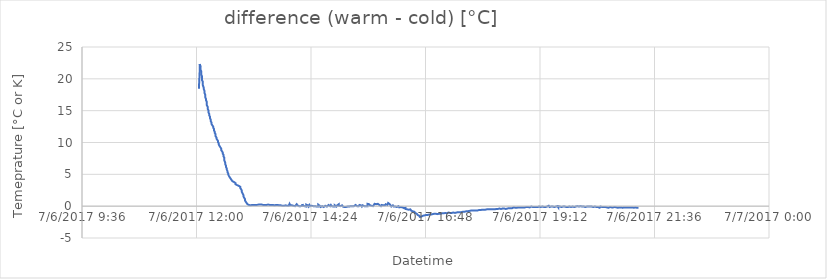
| Category | difference (warm - cold) [°C] |
|---|---|
| 42922.50208333333 | 18.44 |
| 42922.50277777778 | 21.19 |
| 42922.50277777778 | 22.13 |
| 42922.50277777778 | 22.31 |
| 42922.50277777778 | 22.31 |
| 42922.50347222222 | 22.19 |
| 42922.50347222222 | 21.94 |
| 42922.50347222222 | 21.69 |
| 42922.50347222222 | 21.44 |
| 42922.504166666666 | 21.19 |
| 42922.504166666666 | 21 |
| 42922.504166666666 | 20.81 |
| 42922.504166666666 | 20.62 |
| 42922.50486111111 | 20.37 |
| 42922.50486111111 | 20.12 |
| 42922.50486111111 | 19.94 |
| 42922.50486111111 | 19.75 |
| 42922.50555555556 | 19.56 |
| 42922.50555555556 | 19.37 |
| 42922.50555555556 | 19.19 |
| 42922.50555555556 | 19 |
| 42922.50625 | 18.87 |
| 42922.50625 | 18.62 |
| 42922.50625 | 18.44 |
| 42922.50625 | 18.31 |
| 42922.506944444445 | 18.12 |
| 42922.506944444445 | 18 |
| 42922.506944444445 | 17.81 |
| 42922.50763888889 | 17.69 |
| 42922.50763888889 | 17.5 |
| 42922.50763888889 | 17.31 |
| 42922.50763888889 | 17.12 |
| 42922.50833333333 | 17 |
| 42922.50833333333 | 16.81 |
| 42922.50833333333 | 16.62 |
| 42922.50833333333 | 16.5 |
| 42922.50902777778 | 16.37 |
| 42922.50902777778 | 16.19 |
| 42922.50902777778 | 16.06 |
| 42922.50902777778 | 15.88 |
| 42922.509722222225 | 15.75 |
| 42922.509722222225 | 15.63 |
| 42922.509722222225 | 15.5 |
| 42922.509722222225 | 15.31 |
| 42922.510416666664 | 15.19 |
| 42922.510416666664 | 15.06 |
| 42922.510416666664 | 14.94 |
| 42922.510416666664 | 14.75 |
| 42922.51111111111 | 14.69 |
| 42922.51111111111 | 14.5 |
| 42922.51111111111 | 14.38 |
| 42922.51111111111 | 14.25 |
| 42922.51180555556 | 14.13 |
| 42922.51180555556 | 14.06 |
| 42922.51180555556 | 13.94 |
| 42922.51180555556 | 13.81 |
| 42922.5125 | 13.69 |
| 42922.5125 | 13.56 |
| 42922.5125 | 13.44 |
| 42922.5125 | 13.31 |
| 42922.513194444444 | 13.25 |
| 42922.513194444444 | 13.13 |
| 42922.513194444444 | 13 |
| 42922.513194444444 | 12.88 |
| 42922.51388888889 | 12.75 |
| 42922.51388888889 | 12.69 |
| 42922.51388888889 | 12.56 |
| 42922.51458333333 | 12.5 |
| 42922.51458333333 | 12.31 |
| 42922.51458333333 | 12.31 |
| 42922.51458333333 | 12.19 |
| 42922.51527777778 | 12.13 |
| 42922.51527777778 | 12 |
| 42922.51527777778 | 11.88 |
| 42922.51527777778 | 11.75 |
| 42922.51597222222 | 11.69 |
| 42922.51597222222 | 11.56 |
| 42922.51597222222 | 11.5 |
| 42922.51597222222 | 11.38 |
| 42922.51666666667 | 11.31 |
| 42922.51666666667 | 11.25 |
| 42922.51666666667 | 11.19 |
| 42922.51666666667 | 11 |
| 42922.51736111111 | 10.88 |
| 42922.51736111111 | 10.81 |
| 42922.51736111111 | 10.75 |
| 42922.51736111111 | 10.63 |
| 42922.518055555556 | 10.63 |
| 42922.518055555556 | 10.5 |
| 42922.518055555556 | 10.44 |
| 42922.518055555556 | 10.31 |
| 42922.51875 | 10.25 |
| 42922.51875 | 10.19 |
| 42922.51875 | 10.06 |
| 42922.51875 | 10 |
| 42922.51944444444 | 9.88 |
| 42922.51944444444 | 9.81 |
| 42922.51944444444 | 9.75 |
| 42922.51944444444 | 9.69 |
| 42922.52013888889 | 9.63 |
| 42922.52013888889 | 9.56 |
| 42922.52013888889 | 9.44 |
| 42922.52013888889 | 9.38 |
| 42922.520833333336 | 9.31 |
| 42922.520833333336 | 9.25 |
| 42922.520833333336 | 9.19 |
| 42922.521527777775 | 9.06 |
| 42922.521527777775 | 9 |
| 42922.521527777775 | 8.94 |
| 42922.521527777775 | 8.81 |
| 42922.52222222222 | 8.75 |
| 42922.52222222222 | 8.69 |
| 42922.52222222222 | 8.63 |
| 42922.52222222222 | 8.5 |
| 42922.52291666667 | 8.44 |
| 42922.52291666667 | 8.31 |
| 42922.52291666667 | 8.25 |
| 42922.52291666667 | 8.13 |
| 42922.52361111111 | 8.06 |
| 42922.52361111111 | 7.94 |
| 42922.52361111111 | 7.81 |
| 42922.52361111111 | 7.69 |
| 42922.524305555555 | 7.62 |
| 42922.524305555555 | 7.44 |
| 42922.524305555555 | 7.31 |
| 42922.524305555555 | 7.19 |
| 42922.525 | 7.06 |
| 42922.525 | 6.87 |
| 42922.525 | 6.81 |
| 42922.525 | 6.62 |
| 42922.52569444444 | 6.56 |
| 42922.52569444444 | 6.37 |
| 42922.52569444444 | 6.25 |
| 42922.52569444444 | 6.19 |
| 42922.52638888889 | 6.06 |
| 42922.52638888889 | 5.94 |
| 42922.52638888889 | 5.75 |
| 42922.52638888889 | 5.69 |
| 42922.527083333334 | 5.5 |
| 42922.527083333334 | 5.44 |
| 42922.527083333334 | 5.31 |
| 42922.52777777778 | 5.19 |
| 42922.52777777778 | 5.12 |
| 42922.52777777778 | 5.06 |
| 42922.52777777778 | 4.94 |
| 42922.52847222222 | 4.87 |
| 42922.52847222222 | 4.81 |
| 42922.52847222222 | 4.69 |
| 42922.52847222222 | 4.62 |
| 42922.52916666667 | 4.56 |
| 42922.52916666667 | 4.5 |
| 42922.52916666667 | 4.44 |
| 42922.52916666667 | 4.37 |
| 42922.529861111114 | 4.31 |
| 42922.529861111114 | 4.25 |
| 42922.529861111114 | 4.19 |
| 42922.53055555555 | 4.19 |
| 42922.53055555555 | 4.12 |
| 42922.53055555555 | 4.12 |
| 42922.53055555555 | 4.06 |
| 42922.53125 | 4.06 |
| 42922.53125 | 4 |
| 42922.53125 | 3.94 |
| 42922.53125 | 3.87 |
| 42922.53194444445 | 3.94 |
| 42922.53194444445 | 3.87 |
| 42922.53194444445 | 3.81 |
| 42922.53194444445 | 3.81 |
| 42922.532638888886 | 3.81 |
| 42922.532638888886 | 3.75 |
| 42922.532638888886 | 3.81 |
| 42922.532638888886 | 3.81 |
| 42922.53333333333 | 3.75 |
| 42922.53333333333 | 3.75 |
| 42922.53333333333 | 3.69 |
| 42922.53333333333 | 3.69 |
| 42922.53402777778 | 3.62 |
| 42922.53402777778 | 3.56 |
| 42922.53402777778 | 3.5 |
| 42922.53402777778 | 3.44 |
| 42922.53472222222 | 3.44 |
| 42922.53472222222 | 3.37 |
| 42922.53472222222 | 3.37 |
| 42922.53472222222 | 3.37 |
| 42922.535416666666 | 3.31 |
| 42922.535416666666 | 3.31 |
| 42922.535416666666 | 3.25 |
| 42922.535416666666 | 3.25 |
| 42922.53611111111 | 3.25 |
| 42922.53611111111 | 3.25 |
| 42922.53611111111 | 3.25 |
| 42922.53680555556 | 3.19 |
| 42922.53680555556 | 3.19 |
| 42922.53680555556 | 3.19 |
| 42922.53680555556 | 3.19 |
| 42922.5375 | 3.19 |
| 42922.5375 | 3.12 |
| 42922.5375 | 3.12 |
| 42922.5375 | 3.12 |
| 42922.538194444445 | 3.06 |
| 42922.538194444445 | 3 |
| 42922.538194444445 | 2.94 |
| 42922.538194444445 | 2.87 |
| 42922.53888888889 | 2.81 |
| 42922.53888888889 | 2.69 |
| 42922.53888888889 | 2.62 |
| 42922.53888888889 | 2.56 |
| 42922.53958333333 | 2.44 |
| 42922.53958333333 | 2.37 |
| 42922.53958333333 | 2.25 |
| 42922.53958333333 | 2.19 |
| 42922.54027777778 | 2.12 |
| 42922.54027777778 | 2 |
| 42922.54027777778 | 1.94 |
| 42922.54027777778 | 1.87 |
| 42922.540972222225 | 1.75 |
| 42922.540972222225 | 1.69 |
| 42922.540972222225 | 1.56 |
| 42922.540972222225 | 1.5 |
| 42922.541666666664 | 1.44 |
| 42922.541666666664 | 1.31 |
| 42922.541666666664 | 1.25 |
| 42922.54236111111 | 1.12 |
| 42922.54236111111 | 1.06 |
| 42922.54236111111 | 1 |
| 42922.54236111111 | 0.88 |
| 42922.54305555556 | 0.81 |
| 42922.54305555556 | 0.69 |
| 42922.54305555556 | 0.62 |
| 42922.54305555556 | 0.56 |
| 42922.54375 | 0.5 |
| 42922.54375 | 0.5 |
| 42922.54375 | 0.44 |
| 42922.54375 | 0.44 |
| 42922.544444444444 | 0.37 |
| 42922.544444444444 | 0.37 |
| 42922.544444444444 | 0.31 |
| 42922.544444444444 | 0.25 |
| 42922.54513888889 | 0.25 |
| 42922.54513888889 | 0.25 |
| 42922.54513888889 | 0.19 |
| 42922.54513888889 | 0.19 |
| 42922.54583333333 | 0.19 |
| 42922.54583333333 | 0.19 |
| 42922.54583333333 | 0.13 |
| 42922.54583333333 | 0.13 |
| 42922.54652777778 | 0.13 |
| 42922.54652777778 | 0.13 |
| 42922.54652777778 | 0.13 |
| 42922.54722222222 | 0.13 |
| 42922.54722222222 | 0.13 |
| 42922.54722222222 | 0.13 |
| 42922.54722222222 | 0.13 |
| 42922.54791666667 | 0.13 |
| 42922.54791666667 | 0.13 |
| 42922.54791666667 | 0.19 |
| 42922.54791666667 | 0.19 |
| 42922.54861111111 | 0.19 |
| 42922.54861111111 | 0.19 |
| 42922.54861111111 | 0.19 |
| 42922.54861111111 | 0.19 |
| 42922.549305555556 | 0.19 |
| 42922.549305555556 | 0.19 |
| 42922.549305555556 | 0.19 |
| 42922.549305555556 | 0.19 |
| 42922.55 | 0.19 |
| 42922.55 | 0.19 |
| 42922.55 | 0.19 |
| 42922.55 | 0.19 |
| 42922.55069444444 | 0.19 |
| 42922.55069444444 | 0.19 |
| 42922.55069444444 | 0.19 |
| 42922.55069444444 | 0.19 |
| 42922.55138888889 | 0.19 |
| 42922.55138888889 | 0.19 |
| 42922.55138888889 | 0.19 |
| 42922.55138888889 | 0.19 |
| 42922.552083333336 | 0.19 |
| 42922.552083333336 | 0.19 |
| 42922.552083333336 | 0.19 |
| 42922.552777777775 | 0.19 |
| 42922.552777777775 | 0.19 |
| 42922.552777777775 | 0.19 |
| 42922.552777777775 | 0.19 |
| 42922.55347222222 | 0.19 |
| 42922.55347222222 | 0.19 |
| 42922.55347222222 | 0.19 |
| 42922.55347222222 | 0.19 |
| 42922.55416666667 | 0.25 |
| 42922.55416666667 | 0.19 |
| 42922.55416666667 | 0.19 |
| 42922.55416666667 | 0.19 |
| 42922.55486111111 | 0.25 |
| 42922.55486111111 | 0.19 |
| 42922.55486111111 | 0.25 |
| 42922.55486111111 | 0.25 |
| 42922.555555555555 | 0.25 |
| 42922.555555555555 | 0.25 |
| 42922.555555555555 | 0.19 |
| 42922.555555555555 | 0.25 |
| 42922.55625 | 0.25 |
| 42922.55625 | 0.25 |
| 42922.55625 | 0.25 |
| 42922.55625 | 0.25 |
| 42922.55694444444 | 0.25 |
| 42922.55694444444 | 0.19 |
| 42922.55694444444 | 0.19 |
| 42922.55694444444 | 0.19 |
| 42922.55763888889 | 0.19 |
| 42922.55763888889 | 0.19 |
| 42922.55763888889 | 0.19 |
| 42922.55763888889 | 0.19 |
| 42922.558333333334 | 0.19 |
| 42922.558333333334 | 0.19 |
| 42922.558333333334 | 0.19 |
| 42922.558333333334 | 0.19 |
| 42922.55902777778 | 0.19 |
| 42922.55902777778 | 0.19 |
| 42922.55902777778 | 0.19 |
| 42922.55972222222 | 0.19 |
| 42922.55972222222 | 0.19 |
| 42922.55972222222 | 0.19 |
| 42922.55972222222 | 0.19 |
| 42922.56041666667 | 0.19 |
| 42922.56041666667 | 0.19 |
| 42922.56041666667 | 0.19 |
| 42922.56041666667 | 0.19 |
| 42922.561111111114 | 0.19 |
| 42922.561111111114 | 0.25 |
| 42922.561111111114 | 0.19 |
| 42922.561111111114 | 0.19 |
| 42922.56180555555 | 0.25 |
| 42922.56180555555 | 0.25 |
| 42922.56180555555 | 0.13 |
| 42922.5625 | 0.25 |
| 42922.5625 | 0.19 |
| 42922.5625 | 0.19 |
| 42922.5625 | 0.19 |
| 42922.56319444445 | 0.19 |
| 42922.56319444445 | 0.19 |
| 42922.56319444445 | 0.19 |
| 42922.56319444445 | 0.19 |
| 42922.563888888886 | 0.19 |
| 42922.563888888886 | 0.19 |
| 42922.563888888886 | 0.19 |
| 42922.563888888886 | 0.19 |
| 42922.56458333333 | 0.19 |
| 42922.56458333333 | 0.19 |
| 42922.56458333333 | 0.19 |
| 42922.56458333333 | 0.19 |
| 42922.56527777778 | 0.19 |
| 42922.56527777778 | 0.19 |
| 42922.56527777778 | 0.19 |
| 42922.56527777778 | 0.19 |
| 42922.56597222222 | 0.19 |
| 42922.56597222222 | 0.19 |
| 42922.56597222222 | 0.19 |
| 42922.56597222222 | 0.19 |
| 42922.566666666666 | 0.19 |
| 42922.566666666666 | 0.19 |
| 42922.566666666666 | 0.19 |
| 42922.566666666666 | 0.13 |
| 42922.56736111111 | 0.19 |
| 42922.56736111111 | 0.13 |
| 42922.56736111111 | 0.19 |
| 42922.56736111111 | 0.13 |
| 42922.56805555556 | 0.13 |
| 42922.56805555556 | 0.19 |
| 42922.56805555556 | 0.13 |
| 42922.56805555556 | 0.19 |
| 42922.56875 | 0.13 |
| 42922.56875 | 0.19 |
| 42922.56875 | 0.13 |
| 42922.56875 | 0.19 |
| 42922.569444444445 | 0.19 |
| 42922.569444444445 | 0.19 |
| 42922.569444444445 | 0.19 |
| 42922.57013888889 | 0.19 |
| 42922.57013888889 | 0.19 |
| 42922.57013888889 | 0.19 |
| 42922.57013888889 | 0.19 |
| 42922.57083333333 | 0.19 |
| 42922.57083333333 | 0.19 |
| 42922.57083333333 | 0.13 |
| 42922.57083333333 | 0.13 |
| 42922.57152777778 | 0.13 |
| 42922.57152777778 | 0.13 |
| 42922.57152777778 | 0.13 |
| 42922.57152777778 | 0.13 |
| 42922.572222222225 | 0.13 |
| 42922.572222222225 | 0.13 |
| 42922.572222222225 | 0.13 |
| 42922.572222222225 | 0.13 |
| 42922.572916666664 | 0.13 |
| 42922.572916666664 | 0.13 |
| 42922.572916666664 | 0.13 |
| 42922.572916666664 | 0.13 |
| 42922.57361111111 | 0.13 |
| 42922.57361111111 | 0.19 |
| 42922.57361111111 | 0.13 |
| 42922.57361111111 | 0.19 |
| 42922.57430555556 | 0.19 |
| 42922.57430555556 | 0.19 |
| 42922.57430555556 | 0.19 |
| 42922.57430555556 | 0.13 |
| 42922.575 | 0.06 |
| 42922.575 | 0.06 |
| 42922.575 | 0 |
| 42922.575 | 0.06 |
| 42922.575694444444 | 0.06 |
| 42922.575694444444 | 0.06 |
| 42922.575694444444 | 0.06 |
| 42922.57638888889 | 0.06 |
| 42922.57638888889 | 0.06 |
| 42922.57638888889 | 0.06 |
| 42922.57638888889 | 0.06 |
| 42922.57708333333 | 0.06 |
| 42922.57708333333 | 0.06 |
| 42922.57708333333 | 0.06 |
| 42922.57708333333 | 0.13 |
| 42922.57777777778 | 0.13 |
| 42922.57777777778 | 0.13 |
| 42922.57777777778 | 0.13 |
| 42922.57777777778 | 0.13 |
| 42922.57847222222 | 0.06 |
| 42922.57847222222 | 0.06 |
| 42922.57847222222 | 0 |
| 42922.57847222222 | 0.06 |
| 42922.57916666667 | 0.06 |
| 42922.57916666667 | 0.13 |
| 42922.57916666667 | 0.06 |
| 42922.57986111111 | 0.06 |
| 42922.57986111111 | 0.13 |
| 42922.57986111111 | 0.13 |
| 42922.57986111111 | 0.06 |
| 42922.580555555556 | 0.06 |
| 42922.580555555556 | 0.13 |
| 42922.580555555556 | 0.06 |
| 42922.580555555556 | 0.06 |
| 42922.58125 | 0.06 |
| 42922.58125 | 0.19 |
| 42922.58125 | 0.37 |
| 42922.58125 | 0.37 |
| 42922.58194444444 | 0.37 |
| 42922.58194444444 | 0.25 |
| 42922.58194444444 | 0.13 |
| 42922.58194444444 | 0.13 |
| 42922.58263888889 | 0.06 |
| 42922.58263888889 | 0.06 |
| 42922.58263888889 | 0.13 |
| 42922.58263888889 | 0.13 |
| 42922.583333333336 | 0.13 |
| 42922.583333333336 | 0.13 |
| 42922.583333333336 | 0.13 |
| 42922.583333333336 | 0.13 |
| 42922.584027777775 | 0.06 |
| 42922.584027777775 | 0.06 |
| 42922.584027777775 | 0.06 |
| 42922.584027777775 | 0.06 |
| 42922.58472222222 | 0.06 |
| 42922.58472222222 | 0.06 |
| 42922.58472222222 | 0.06 |
| 42922.58472222222 | 0.06 |
| 42922.58541666667 | 0.06 |
| 42922.58541666667 | 0.06 |
| 42922.58541666667 | 0 |
| 42922.58541666667 | 0 |
| 42922.58611111111 | 0 |
| 42922.58611111111 | 0 |
| 42922.58611111111 | 0 |
| 42922.58611111111 | 0 |
| 42922.586805555555 | 0.06 |
| 42922.586805555555 | 0 |
| 42922.586805555555 | 0.06 |
| 42922.586805555555 | 0.06 |
| 42922.5875 | 0.31 |
| 42922.5875 | 0.31 |
| 42922.5875 | 0.25 |
| 42922.5875 | 0.19 |
| 42922.58819444444 | 0.13 |
| 42922.58819444444 | 0.13 |
| 42922.58819444444 | 0.06 |
| 42922.58888888889 | 0.13 |
| 42922.58888888889 | 0.06 |
| 42922.58888888889 | 0.06 |
| 42922.58888888889 | 0 |
| 42922.589583333334 | 0 |
| 42922.589583333334 | -0.06 |
| 42922.589583333334 | 0 |
| 42922.589583333334 | 0 |
| 42922.59027777778 | 0 |
| 42922.59027777778 | 0 |
| 42922.59027777778 | 0 |
| 42922.59027777778 | -0.06 |
| 42922.59097222222 | 0 |
| 42922.59097222222 | 0.06 |
| 42922.59097222222 | 0.06 |
| 42922.59097222222 | 0.06 |
| 42922.59166666667 | 0.06 |
| 42922.59166666667 | 0 |
| 42922.59166666667 | 0.06 |
| 42922.59166666667 | 0.06 |
| 42922.592361111114 | 0.06 |
| 42922.592361111114 | 0 |
| 42922.592361111114 | 0.19 |
| 42922.592361111114 | 0.31 |
| 42922.59305555555 | 0.25 |
| 42922.59305555555 | 0.06 |
| 42922.59305555555 | 0.06 |
| 42922.59305555555 | 0 |
| 42922.59375 | 0 |
| 42922.59375 | 0 |
| 42922.59375 | 0 |
| 42922.59444444445 | 0 |
| 42922.59444444445 | 0 |
| 42922.59444444445 | 0 |
| 42922.59444444445 | 0 |
| 42922.595138888886 | 0 |
| 42922.595138888886 | 0 |
| 42922.595138888886 | 0 |
| 42922.595138888886 | -0.06 |
| 42922.59583333333 | -0.06 |
| 42922.59583333333 | 0 |
| 42922.59583333333 | 0.06 |
| 42922.59583333333 | 0.25 |
| 42922.59652777778 | 0.37 |
| 42922.59652777778 | 0.25 |
| 42922.59652777778 | 0.31 |
| 42922.59652777778 | 0.19 |
| 42922.59722222222 | 0.13 |
| 42922.59722222222 | 0.13 |
| 42922.59722222222 | 0.06 |
| 42922.59722222222 | 0.06 |
| 42922.597916666666 | 0 |
| 42922.597916666666 | 0 |
| 42922.597916666666 | 0 |
| 42922.597916666666 | -0.06 |
| 42922.59861111111 | 0.19 |
| 42922.59861111111 | 0.31 |
| 42922.59861111111 | 0.31 |
| 42922.59930555556 | 0.19 |
| 42922.59930555556 | 0.06 |
| 42922.59930555556 | 0.06 |
| 42922.59930555556 | 0 |
| 42922.6 | 0 |
| 42922.6 | 0 |
| 42922.6 | 0 |
| 42922.6 | 0 |
| 42922.600694444445 | 0.06 |
| 42922.600694444445 | 0 |
| 42922.600694444445 | 0 |
| 42922.600694444445 | 0 |
| 42922.60138888889 | 0.06 |
| 42922.60138888889 | 0.06 |
| 42922.60138888889 | 0.06 |
| 42922.60138888889 | 0 |
| 42922.60208333333 | 0 |
| 42922.60208333333 | -0.06 |
| 42922.60208333333 | -0.13 |
| 42922.60208333333 | -0.13 |
| 42922.60277777778 | -0.06 |
| 42922.60277777778 | -0.06 |
| 42922.60277777778 | 0 |
| 42922.60277777778 | 0.06 |
| 42922.603472222225 | 0 |
| 42922.603472222225 | 0 |
| 42922.603472222225 | 0.06 |
| 42922.604166666664 | 0.06 |
| 42922.604166666664 | 0.06 |
| 42922.604166666664 | 0 |
| 42922.604166666664 | 0 |
| 42922.60486111111 | -0.06 |
| 42922.60486111111 | -0.06 |
| 42922.60486111111 | -0.06 |
| 42922.60486111111 | -0.06 |
| 42922.60555555556 | -0.06 |
| 42922.60555555556 | -0.13 |
| 42922.60555555556 | -0.13 |
| 42922.60555555556 | -0.13 |
| 42922.60625 | -0.06 |
| 42922.60625 | 0.25 |
| 42922.60625 | 0.37 |
| 42922.60625 | 0.25 |
| 42922.606944444444 | 0.25 |
| 42922.606944444444 | 0.19 |
| 42922.606944444444 | 0.13 |
| 42922.606944444444 | 0.13 |
| 42922.60763888889 | 0.06 |
| 42922.60763888889 | 0.06 |
| 42922.60763888889 | -0.06 |
| 42922.60763888889 | -0.06 |
| 42922.60833333333 | -0.06 |
| 42922.60833333333 | -0.06 |
| 42922.60833333333 | -0.06 |
| 42922.60833333333 | -0.13 |
| 42922.60902777778 | -0.13 |
| 42922.60902777778 | -0.06 |
| 42922.60902777778 | -0.06 |
| 42922.60972222222 | 0 |
| 42922.60972222222 | -0.06 |
| 42922.60972222222 | -0.06 |
| 42922.60972222222 | -0.06 |
| 42922.61041666667 | -0.06 |
| 42922.61041666667 | -0.06 |
| 42922.61041666667 | -0.13 |
| 42922.61041666667 | -0.13 |
| 42922.61111111111 | -0.13 |
| 42922.61111111111 | -0.13 |
| 42922.61111111111 | -0.13 |
| 42922.61111111111 | -0.06 |
| 42922.611805555556 | -0.06 |
| 42922.611805555556 | -0.13 |
| 42922.611805555556 | 0 |
| 42922.611805555556 | 0 |
| 42922.6125 | 0.06 |
| 42922.6125 | 0 |
| 42922.6125 | 0 |
| 42922.6125 | 0 |
| 42922.61319444444 | 0 |
| 42922.61319444444 | 0 |
| 42922.61319444444 | 0 |
| 42922.61319444444 | -0.06 |
| 42922.61388888889 | -0.06 |
| 42922.61388888889 | -0.06 |
| 42922.61388888889 | -0.06 |
| 42922.61388888889 | -0.06 |
| 42922.614583333336 | -0.13 |
| 42922.614583333336 | -0.13 |
| 42922.614583333336 | -0.06 |
| 42922.615277777775 | 0.19 |
| 42922.615277777775 | 0.25 |
| 42922.615277777775 | 0.25 |
| 42922.615277777775 | 0.19 |
| 42922.61597222222 | 0.19 |
| 42922.61597222222 | 0.19 |
| 42922.61597222222 | 0.25 |
| 42922.61597222222 | 0.13 |
| 42922.61666666667 | 0 |
| 42922.61666666667 | -0.06 |
| 42922.61666666667 | -0.06 |
| 42922.61666666667 | 0 |
| 42922.61736111111 | 0.06 |
| 42922.61736111111 | 0.19 |
| 42922.61736111111 | 0.13 |
| 42922.61736111111 | 0.13 |
| 42922.618055555555 | 0.06 |
| 42922.618055555555 | 0.06 |
| 42922.618055555555 | 0 |
| 42922.618055555555 | 0.06 |
| 42922.61875 | 0 |
| 42922.61875 | 0 |
| 42922.61875 | -0.06 |
| 42922.61944444444 | -0.06 |
| 42922.61944444444 | -0.06 |
| 42922.61944444444 | -0.06 |
| 42922.61944444444 | -0.13 |
| 42922.62013888889 | -0.19 |
| 42922.62013888889 | -0.06 |
| 42922.62013888889 | -0.13 |
| 42922.62013888889 | -0.06 |
| 42922.620833333334 | -0.06 |
| 42922.620833333334 | 0.13 |
| 42922.620833333334 | 0.13 |
| 42922.620833333334 | 0.06 |
| 42922.62152777778 | 0.06 |
| 42922.62152777778 | 0 |
| 42922.62152777778 | 0 |
| 42922.62152777778 | 0 |
| 42922.62222222222 | -0.06 |
| 42922.62222222222 | 0 |
| 42922.62222222222 | 0 |
| 42922.62222222222 | -0.06 |
| 42922.62291666667 | 0 |
| 42922.62291666667 | 0.06 |
| 42922.62291666667 | 0 |
| 42922.62291666667 | 0.13 |
| 42922.623611111114 | 0.13 |
| 42922.623611111114 | 0.13 |
| 42922.623611111114 | 0.25 |
| 42922.62430555555 | 0.31 |
| 42922.62430555555 | 0.25 |
| 42922.62430555555 | 0.19 |
| 42922.62430555555 | 0.06 |
| 42922.625 | 0.06 |
| 42922.625 | 0.06 |
| 42922.625 | 0 |
| 42922.625 | 0 |
| 42922.62569444445 | 0 |
| 42922.62569444445 | 0 |
| 42922.62569444445 | -0.06 |
| 42922.62569444445 | -0.06 |
| 42922.626388888886 | -0.06 |
| 42922.626388888886 | -0.06 |
| 42922.626388888886 | 0 |
| 42922.626388888886 | 0 |
| 42922.62708333333 | 0.13 |
| 42922.62708333333 | 0.06 |
| 42922.62708333333 | 0.06 |
| 42922.62708333333 | 0.13 |
| 42922.62777777778 | 0.06 |
| 42922.62777777778 | 0 |
| 42922.62777777778 | -0.06 |
| 42922.62847222222 | -0.13 |
| 42922.62847222222 | -0.13 |
| 42922.62847222222 | -0.06 |
| 42922.62847222222 | -0.06 |
| 42922.629166666666 | -0.13 |
| 42922.629166666666 | -0.13 |
| 42922.629166666666 | -0.19 |
| 42922.629166666666 | -0.19 |
| 42922.62986111111 | -0.19 |
| 42922.62986111111 | -0.13 |
| 42922.62986111111 | -0.13 |
| 42922.62986111111 | -0.13 |
| 42922.63055555556 | -0.13 |
| 42922.63055555556 | -0.13 |
| 42922.63055555556 | -0.13 |
| 42922.63055555556 | -0.13 |
| 42922.63125 | -0.13 |
| 42922.63125 | -0.13 |
| 42922.63125 | -0.06 |
| 42922.63125 | -0.06 |
| 42922.631944444445 | -0.06 |
| 42922.631944444445 | -0.06 |
| 42922.631944444445 | -0.13 |
| 42922.631944444445 | 0 |
| 42922.63263888889 | -0.06 |
| 42922.63263888889 | -0.06 |
| 42922.63263888889 | -0.06 |
| 42922.63333333333 | -0.06 |
| 42922.63333333333 | -0.06 |
| 42922.63333333333 | -0.06 |
| 42922.63333333333 | 0 |
| 42922.63402777778 | -0.13 |
| 42922.63402777778 | -0.13 |
| 42922.63402777778 | -0.06 |
| 42922.63402777778 | -0.06 |
| 42922.634722222225 | 0 |
| 42922.634722222225 | -0.06 |
| 42922.634722222225 | 0 |
| 42922.634722222225 | 0 |
| 42922.635416666664 | 0 |
| 42922.635416666664 | -0.06 |
| 42922.635416666664 | 0 |
| 42922.635416666664 | 0 |
| 42922.63611111111 | 0 |
| 42922.63611111111 | 0 |
| 42922.63611111111 | 0 |
| 42922.63611111111 | 0.06 |
| 42922.63680555556 | 0.13 |
| 42922.63680555556 | 0 |
| 42922.63680555556 | 0.06 |
| 42922.63680555556 | 0 |
| 42922.6375 | 0 |
| 42922.6375 | -0.06 |
| 42922.6375 | -0.13 |
| 42922.6375 | -0.06 |
| 42922.638194444444 | -0.06 |
| 42922.638194444444 | -0.06 |
| 42922.638194444444 | 0 |
| 42922.638194444444 | 0.06 |
| 42922.63888888889 | 0.19 |
| 42922.63888888889 | 0.19 |
| 42922.63888888889 | 0.19 |
| 42922.63888888889 | 0.13 |
| 42922.63958333333 | 0.19 |
| 42922.63958333333 | 0.13 |
| 42922.63958333333 | 0.06 |
| 42922.64027777778 | 0 |
| 42922.64027777778 | 0 |
| 42922.64027777778 | 0.06 |
| 42922.64027777778 | 0.06 |
| 42922.64097222222 | 0.06 |
| 42922.64097222222 | 0 |
| 42922.64097222222 | 0 |
| 42922.64097222222 | 0 |
| 42922.64166666667 | 0 |
| 42922.64166666667 | -0.13 |
| 42922.64166666667 | -0.06 |
| 42922.64166666667 | -0.06 |
| 42922.64236111111 | 0.19 |
| 42922.64236111111 | 0.25 |
| 42922.64236111111 | 0.31 |
| 42922.64236111111 | 0.25 |
| 42922.643055555556 | 0.19 |
| 42922.643055555556 | 0.19 |
| 42922.643055555556 | 0.19 |
| 42922.643055555556 | 0.13 |
| 42922.64375 | 0.13 |
| 42922.64375 | 0.06 |
| 42922.64375 | 0.06 |
| 42922.64375 | 0 |
| 42922.64444444444 | 0 |
| 42922.64444444444 | -0.06 |
| 42922.64444444444 | 0 |
| 42922.64513888889 | 0 |
| 42922.64513888889 | 0 |
| 42922.64513888889 | 0 |
| 42922.64513888889 | 0.13 |
| 42922.645833333336 | 0.13 |
| 42922.645833333336 | 0.13 |
| 42922.645833333336 | 0.13 |
| 42922.645833333336 | 0.06 |
| 42922.646527777775 | 0 |
| 42922.646527777775 | -0.06 |
| 42922.646527777775 | -0.13 |
| 42922.646527777775 | -0.13 |
| 42922.64722222222 | -0.13 |
| 42922.64722222222 | -0.13 |
| 42922.64722222222 | -0.06 |
| 42922.64722222222 | -0.06 |
| 42922.64791666667 | 0 |
| 42922.64791666667 | -0.06 |
| 42922.64791666667 | 0 |
| 42922.64791666667 | 0 |
| 42922.64861111111 | -0.06 |
| 42922.64861111111 | 0.06 |
| 42922.64861111111 | -0.06 |
| 42922.64861111111 | 0 |
| 42922.649305555555 | 0 |
| 42922.649305555555 | 0 |
| 42922.649305555555 | 0.13 |
| 42922.649305555555 | 0.37 |
| 42922.65 | 0.37 |
| 42922.65 | 0.44 |
| 42922.65 | 0.37 |
| 42922.65069444444 | 0.31 |
| 42922.65069444444 | 0.25 |
| 42922.65069444444 | 0.25 |
| 42922.65069444444 | 0.31 |
| 42922.65138888889 | 0.25 |
| 42922.65138888889 | 0.19 |
| 42922.65138888889 | 0.19 |
| 42922.65138888889 | 0.13 |
| 42922.652083333334 | 0.06 |
| 42922.652083333334 | 0 |
| 42922.652083333334 | 0 |
| 42922.652083333334 | 0.06 |
| 42922.65277777778 | 0.06 |
| 42922.65277777778 | 0.06 |
| 42922.65277777778 | 0.06 |
| 42922.65277777778 | 0.13 |
| 42922.65347222222 | 0.13 |
| 42922.65347222222 | 0.06 |
| 42922.65347222222 | 0 |
| 42922.65347222222 | 0 |
| 42922.65416666667 | 0 |
| 42922.65416666667 | 0 |
| 42922.65416666667 | -0.06 |
| 42922.65416666667 | 0 |
| 42922.654861111114 | 0 |
| 42922.654861111114 | 0.06 |
| 42922.654861111114 | 0.13 |
| 42922.654861111114 | 0.19 |
| 42922.65555555555 | 0.31 |
| 42922.65555555555 | 0.31 |
| 42922.65555555555 | 0.37 |
| 42922.65555555555 | 0.31 |
| 42922.65625 | 0.37 |
| 42922.65625 | 0.31 |
| 42922.65625 | 0.31 |
| 42922.65625 | 0.25 |
| 42922.65694444445 | 0.31 |
| 42922.65694444445 | 0.31 |
| 42922.65694444445 | 0.37 |
| 42922.65694444445 | 0.37 |
| 42922.657638888886 | 0.37 |
| 42922.657638888886 | 0.37 |
| 42922.657638888886 | 0.25 |
| 42922.65833333333 | 0.37 |
| 42922.65833333333 | 0.5 |
| 42922.65833333333 | 0.44 |
| 42922.65833333333 | 0.44 |
| 42922.65902777778 | 0.5 |
| 42922.65902777778 | 0.44 |
| 42922.65902777778 | 0.31 |
| 42922.65902777778 | 0.25 |
| 42922.65972222222 | 0.19 |
| 42922.65972222222 | 0.25 |
| 42922.65972222222 | 0.25 |
| 42922.65972222222 | 0.13 |
| 42922.660416666666 | 0.06 |
| 42922.660416666666 | 0.13 |
| 42922.660416666666 | 0.06 |
| 42922.660416666666 | 0.06 |
| 42922.66111111111 | 0 |
| 42922.66111111111 | 0 |
| 42922.66111111111 | 0.06 |
| 42922.66180555556 | 0.19 |
| 42922.66180555556 | 0.19 |
| 42922.66180555556 | 0.19 |
| 42922.66180555556 | 0.19 |
| 42922.6625 | 0.19 |
| 42922.6625 | 0.19 |
| 42922.6625 | 0.25 |
| 42922.6625 | 0.19 |
| 42922.663194444445 | 0.13 |
| 42922.663194444445 | 0.06 |
| 42922.663194444445 | 0.06 |
| 42922.663194444445 | 0 |
| 42922.66388888889 | 0 |
| 42922.66388888889 | 0 |
| 42922.66388888889 | 0.06 |
| 42922.66388888889 | 0.13 |
| 42922.66458333333 | 0.13 |
| 42922.66458333333 | 0.13 |
| 42922.66458333333 | 0.19 |
| 42922.66458333333 | 0.19 |
| 42922.66527777778 | 0.25 |
| 42922.66527777778 | 0.31 |
| 42922.66527777778 | 0.31 |
| 42922.66527777778 | 0.44 |
| 42922.665972222225 | 0.44 |
| 42922.665972222225 | 0.37 |
| 42922.665972222225 | 0.25 |
| 42922.666666666664 | 0.19 |
| 42922.666666666664 | 0.31 |
| 42922.666666666664 | 0.25 |
| 42922.666666666664 | 0.25 |
| 42922.66736111111 | 0.25 |
| 42922.66736111111 | 0.31 |
| 42922.66736111111 | 0.5 |
| 42922.66736111111 | 0.5 |
| 42922.66805555556 | 0.56 |
| 42922.66805555556 | 0.5 |
| 42922.66805555556 | 0.5 |
| 42922.66805555556 | 0.44 |
| 42922.66875 | 0.31 |
| 42922.66875 | 0.25 |
| 42922.66875 | 0.25 |
| 42922.66875 | 0.25 |
| 42922.669444444444 | 0.13 |
| 42922.669444444444 | 0.13 |
| 42922.669444444444 | 0.13 |
| 42922.669444444444 | 0.13 |
| 42922.67013888889 | 0.06 |
| 42922.67013888889 | -0.06 |
| 42922.67013888889 | -0.06 |
| 42922.67083333333 | -0.06 |
| 42922.67083333333 | -0.06 |
| 42922.67083333333 | 0 |
| 42922.67083333333 | 0 |
| 42922.67152777778 | 0.13 |
| 42922.67152777778 | 0.19 |
| 42922.67152777778 | 0.13 |
| 42922.67152777778 | 0.06 |
| 42922.67222222222 | 0.06 |
| 42922.67222222222 | 0 |
| 42922.67222222222 | -0.06 |
| 42922.67222222222 | -0.13 |
| 42922.67291666667 | -0.06 |
| 42922.67291666667 | -0.06 |
| 42922.67291666667 | -0.13 |
| 42922.67291666667 | -0.13 |
| 42922.67361111111 | -0.06 |
| 42922.67361111111 | 0 |
| 42922.67361111111 | 0 |
| 42922.674305555556 | 0.06 |
| 42922.674305555556 | 0.06 |
| 42922.674305555556 | 0 |
| 42922.674305555556 | -0.13 |
| 42922.675 | -0.13 |
| 42922.675 | -0.13 |
| 42922.675 | -0.06 |
| 42922.675 | 0 |
| 42922.67569444444 | 0 |
| 42922.67569444444 | 0 |
| 42922.67569444444 | 0 |
| 42922.67569444444 | 0 |
| 42922.67638888889 | 0 |
| 42922.67638888889 | 0 |
| 42922.67638888889 | -0.13 |
| 42922.67638888889 | -0.13 |
| 42922.677083333336 | -0.19 |
| 42922.677083333336 | -0.13 |
| 42922.677083333336 | -0.13 |
| 42922.677083333336 | -0.06 |
| 42922.677777777775 | -0.13 |
| 42922.677777777775 | -0.31 |
| 42922.677777777775 | -0.31 |
| 42922.677777777775 | -0.25 |
| 42922.67847222222 | -0.13 |
| 42922.67847222222 | -0.13 |
| 42922.67847222222 | -0.06 |
| 42922.67847222222 | -0.06 |
| 42922.67916666667 | -0.13 |
| 42922.67916666667 | -0.13 |
| 42922.67916666667 | -0.19 |
| 42922.67986111111 | -0.19 |
| 42922.67986111111 | -0.13 |
| 42922.67986111111 | -0.19 |
| 42922.67986111111 | -0.19 |
| 42922.680555555555 | -0.31 |
| 42922.680555555555 | -0.31 |
| 42922.680555555555 | -0.25 |
| 42922.680555555555 | -0.25 |
| 42922.68125 | -0.31 |
| 42922.68125 | -0.25 |
| 42922.68125 | -0.25 |
| 42922.68125 | -0.19 |
| 42922.68194444444 | -0.25 |
| 42922.68194444444 | -0.31 |
| 42922.68194444444 | -0.31 |
| 42922.68194444444 | -0.25 |
| 42922.68263888889 | -0.25 |
| 42922.68263888889 | -0.31 |
| 42922.68263888889 | -0.37 |
| 42922.68263888889 | -0.44 |
| 42922.683333333334 | -0.5 |
| 42922.683333333334 | -0.56 |
| 42922.683333333334 | -0.5 |
| 42922.683333333334 | -0.5 |
| 42922.68402777778 | -0.5 |
| 42922.68402777778 | -0.44 |
| 42922.68402777778 | -0.44 |
| 42922.68402777778 | -0.44 |
| 42922.68472222222 | -0.62 |
| 42922.68472222222 | -0.62 |
| 42922.68472222222 | -0.62 |
| 42922.68472222222 | -0.62 |
| 42922.68541666667 | -0.56 |
| 42922.68541666667 | -0.69 |
| 42922.68541666667 | -0.69 |
| 42922.68541666667 | -0.62 |
| 42922.686111111114 | -0.5 |
| 42922.686111111114 | -0.5 |
| 42922.686111111114 | -0.5 |
| 42922.686111111114 | -0.56 |
| 42922.68680555555 | -0.5 |
| 42922.68680555555 | -0.5 |
| 42922.68680555555 | -0.56 |
| 42922.6875 | -0.62 |
| 42922.6875 | -0.69 |
| 42922.6875 | -0.69 |
| 42922.6875 | -0.69 |
| 42922.68819444445 | -0.75 |
| 42922.68819444445 | -0.75 |
| 42922.68819444445 | -0.81 |
| 42922.68819444445 | -0.81 |
| 42922.688888888886 | -0.81 |
| 42922.688888888886 | -0.81 |
| 42922.688888888886 | -0.81 |
| 42922.688888888886 | -0.88 |
| 42922.68958333333 | -0.94 |
| 42922.68958333333 | -0.94 |
| 42922.68958333333 | -0.94 |
| 42922.68958333333 | -0.94 |
| 42922.69027777778 | -0.88 |
| 42922.69027777778 | -0.94 |
| 42922.69027777778 | -1 |
| 42922.69027777778 | -1 |
| 42922.69097222222 | -1 |
| 42922.69097222222 | -1 |
| 42922.69097222222 | -1 |
| 42922.69097222222 | -1.06 |
| 42922.691666666666 | -1.06 |
| 42922.691666666666 | -1.06 |
| 42922.691666666666 | -1.12 |
| 42922.691666666666 | -1.19 |
| 42922.69236111111 | -1.19 |
| 42922.69236111111 | -1.25 |
| 42922.69236111111 | -1.25 |
| 42922.69305555556 | -1.31 |
| 42922.69305555556 | -1.31 |
| 42922.69305555556 | -1.31 |
| 42922.69305555556 | -1.37 |
| 42922.69375 | -1.37 |
| 42922.69375 | -1.44 |
| 42922.69375 | -1.5 |
| 42922.69375 | -1.44 |
| 42922.694444444445 | -1.5 |
| 42922.694444444445 | -1.5 |
| 42922.694444444445 | -1.56 |
| 42922.694444444445 | -1.56 |
| 42922.69513888889 | -1.56 |
| 42922.69513888889 | -1.56 |
| 42922.69513888889 | -1.62 |
| 42922.69513888889 | -1.69 |
| 42922.69583333333 | -1.69 |
| 42922.69583333333 | -1.62 |
| 42922.69583333333 | -1.62 |
| 42922.69583333333 | -1.62 |
| 42922.69652777778 | -1.62 |
| 42922.69652777778 | -1.62 |
| 42922.69652777778 | -1.56 |
| 42922.69652777778 | -1.56 |
| 42922.697222222225 | -1.5 |
| 42922.697222222225 | -1.56 |
| 42922.697222222225 | -1.56 |
| 42922.697222222225 | -1.5 |
| 42922.697916666664 | -1.5 |
| 42922.697916666664 | -1.5 |
| 42922.697916666664 | -1.44 |
| 42922.697916666664 | -1.44 |
| 42922.69861111111 | -1.44 |
| 42922.69861111111 | -1.44 |
| 42922.69861111111 | -1.44 |
| 42922.69930555556 | -1.44 |
| 42922.69930555556 | -1.44 |
| 42922.69930555556 | -1.44 |
| 42922.69930555556 | -1.44 |
| 42922.7 | -1.44 |
| 42922.7 | -1.37 |
| 42922.7 | -1.37 |
| 42922.7 | -1.37 |
| 42922.700694444444 | -1.37 |
| 42922.700694444444 | -1.37 |
| 42922.700694444444 | -1.31 |
| 42922.700694444444 | -1.31 |
| 42922.70138888889 | -1.37 |
| 42922.70138888889 | -1.31 |
| 42922.70138888889 | -1.31 |
| 42922.70138888889 | -1.31 |
| 42922.70208333333 | -1.37 |
| 42922.70208333333 | -1.31 |
| 42922.70208333333 | -1.37 |
| 42922.70208333333 | -1.31 |
| 42922.70277777778 | -1.31 |
| 42922.70277777778 | -1.31 |
| 42922.70277777778 | -1.31 |
| 42922.70277777778 | -1.31 |
| 42922.70347222222 | -1.31 |
| 42922.70347222222 | -1.31 |
| 42922.70347222222 | -1.31 |
| 42922.70416666667 | -1.25 |
| 42922.70416666667 | -1.31 |
| 42922.70416666667 | -1.31 |
| 42922.70416666667 | -1.31 |
| 42922.70486111111 | -1.31 |
| 42922.70486111111 | -1.25 |
| 42922.70486111111 | -1.31 |
| 42922.70486111111 | -1.25 |
| 42922.705555555556 | -1.25 |
| 42922.705555555556 | -1.31 |
| 42922.705555555556 | -1.25 |
| 42922.705555555556 | -1.25 |
| 42922.70625 | -1.25 |
| 42922.70625 | -1.25 |
| 42922.70625 | -1.25 |
| 42922.70625 | -1.19 |
| 42922.70694444444 | -1.25 |
| 42922.70694444444 | -1.25 |
| 42922.70694444444 | -1.31 |
| 42922.70694444444 | -1.25 |
| 42922.70763888889 | -1.19 |
| 42922.70763888889 | -1.25 |
| 42922.70763888889 | -1.19 |
| 42922.70763888889 | -1.19 |
| 42922.708333333336 | -1.19 |
| 42922.708333333336 | -1.25 |
| 42922.708333333336 | -1.25 |
| 42922.708333333336 | -1.25 |
| 42922.709027777775 | -1.19 |
| 42922.709027777775 | -1.19 |
| 42922.709027777775 | -1.19 |
| 42922.709027777775 | -1.19 |
| 42922.70972222222 | -1.19 |
| 42922.70972222222 | -1.19 |
| 42922.70972222222 | -1.25 |
| 42922.71041666667 | -1.25 |
| 42922.71041666667 | -1.19 |
| 42922.71041666667 | -1.19 |
| 42922.71041666667 | -1.19 |
| 42922.71111111111 | -1.19 |
| 42922.71111111111 | -1.19 |
| 42922.71111111111 | -1.19 |
| 42922.71111111111 | -1.19 |
| 42922.711805555555 | -1.19 |
| 42922.711805555555 | -1.19 |
| 42922.711805555555 | -1.19 |
| 42922.711805555555 | -1.19 |
| 42922.7125 | -1.19 |
| 42922.7125 | -1.19 |
| 42922.7125 | -1.19 |
| 42922.7125 | -1.19 |
| 42922.71319444444 | -1.19 |
| 42922.71319444444 | -1.19 |
| 42922.71319444444 | -1.19 |
| 42922.71319444444 | -1.19 |
| 42922.71388888889 | -1.12 |
| 42922.71388888889 | -1.12 |
| 42922.71388888889 | -1.12 |
| 42922.71388888889 | -1.12 |
| 42922.714583333334 | -1.12 |
| 42922.714583333334 | -1.12 |
| 42922.714583333334 | -1.12 |
| 42922.714583333334 | -1.12 |
| 42922.71527777778 | -1.12 |
| 42922.71527777778 | -1.12 |
| 42922.71527777778 | -1.12 |
| 42922.71597222222 | -1.12 |
| 42922.71597222222 | -1.12 |
| 42922.71597222222 | -1.19 |
| 42922.71597222222 | -1.12 |
| 42922.71666666667 | -1.12 |
| 42922.71666666667 | -1.12 |
| 42922.71666666667 | -1.12 |
| 42922.71666666667 | -1.12 |
| 42922.717361111114 | -1.06 |
| 42922.717361111114 | -1.06 |
| 42922.717361111114 | -1.12 |
| 42922.717361111114 | -1.12 |
| 42922.71805555555 | -1.12 |
| 42922.71805555555 | -1.06 |
| 42922.71805555555 | -1.06 |
| 42922.71805555555 | -1.12 |
| 42922.71875 | -1.12 |
| 42922.71875 | -1.06 |
| 42922.71875 | -1.06 |
| 42922.71875 | -1.06 |
| 42922.71944444445 | -1.06 |
| 42922.71944444445 | -1.06 |
| 42922.71944444445 | -1.06 |
| 42922.71944444445 | -1.06 |
| 42922.720138888886 | -1 |
| 42922.720138888886 | -1 |
| 42922.720138888886 | -1.06 |
| 42922.72083333333 | -1 |
| 42922.72083333333 | -1.06 |
| 42922.72083333333 | -1.06 |
| 42922.72083333333 | -1 |
| 42922.72152777778 | -1.06 |
| 42922.72152777778 | -1.06 |
| 42922.72152777778 | -1.06 |
| 42922.72152777778 | -1.06 |
| 42922.72222222222 | -1.06 |
| 42922.72222222222 | -1.06 |
| 42922.72222222222 | -1.06 |
| 42922.72222222222 | -1 |
| 42922.722916666666 | -1.06 |
| 42922.722916666666 | -1.06 |
| 42922.722916666666 | -1 |
| 42922.722916666666 | -1.06 |
| 42922.72361111111 | -1.06 |
| 42922.72361111111 | -1 |
| 42922.72361111111 | -1.06 |
| 42922.72361111111 | -1 |
| 42922.72430555556 | -1 |
| 42922.72430555556 | -1 |
| 42922.72430555556 | -1 |
| 42922.72430555556 | -1.06 |
| 42922.725 | -1 |
| 42922.725 | -1 |
| 42922.725 | -0.94 |
| 42922.725 | -1 |
| 42922.725694444445 | -1.06 |
| 42922.725694444445 | -1 |
| 42922.725694444445 | -1 |
| 42922.725694444445 | -0.94 |
| 42922.72638888889 | -1 |
| 42922.72638888889 | -1 |
| 42922.72638888889 | -1 |
| 42922.72638888889 | -0.94 |
| 42922.72708333333 | -1 |
| 42922.72708333333 | -0.94 |
| 42922.72708333333 | -1 |
| 42922.72777777778 | -0.94 |
| 42922.72777777778 | -1 |
| 42922.72777777778 | -0.94 |
| 42922.72777777778 | -0.94 |
| 42922.728472222225 | -0.94 |
| 42922.728472222225 | -0.94 |
| 42922.728472222225 | -0.94 |
| 42922.728472222225 | -1 |
| 42922.729166666664 | -0.94 |
| 42922.729166666664 | -0.94 |
| 42922.729166666664 | -0.94 |
| 42922.729166666664 | -0.94 |
| 42922.72986111111 | -0.94 |
| 42922.72986111111 | -0.94 |
| 42922.72986111111 | -0.94 |
| 42922.72986111111 | -0.94 |
| 42922.73055555556 | -0.94 |
| 42922.73055555556 | -0.88 |
| 42922.73055555556 | -0.94 |
| 42922.73055555556 | -0.94 |
| 42922.73125 | -0.94 |
| 42922.73125 | -0.94 |
| 42922.73125 | -0.94 |
| 42922.731944444444 | -0.94 |
| 42922.731944444444 | -0.88 |
| 42922.731944444444 | -0.94 |
| 42922.731944444444 | -0.88 |
| 42922.73263888889 | -0.88 |
| 42922.73263888889 | -0.88 |
| 42922.73263888889 | -0.88 |
| 42922.73263888889 | -0.88 |
| 42922.73333333333 | -0.88 |
| 42922.73333333333 | -0.88 |
| 42922.73333333333 | -0.88 |
| 42922.73333333333 | -0.88 |
| 42922.73402777778 | -0.88 |
| 42922.73402777778 | -0.88 |
| 42922.73402777778 | -0.81 |
| 42922.73402777778 | -0.88 |
| 42922.73472222222 | -0.81 |
| 42922.73472222222 | -0.88 |
| 42922.73472222222 | -0.94 |
| 42922.73472222222 | -0.81 |
| 42922.73541666667 | -0.81 |
| 42922.73541666667 | -0.81 |
| 42922.73541666667 | -0.81 |
| 42922.73541666667 | -0.75 |
| 42922.73611111111 | -0.81 |
| 42922.73611111111 | -0.81 |
| 42922.73611111111 | -0.81 |
| 42922.736805555556 | -0.81 |
| 42922.736805555556 | -0.81 |
| 42922.736805555556 | -0.81 |
| 42922.736805555556 | -0.75 |
| 42922.7375 | -0.75 |
| 42922.7375 | -0.75 |
| 42922.7375 | -0.81 |
| 42922.7375 | -0.81 |
| 42922.73819444444 | -0.75 |
| 42922.73819444444 | -0.75 |
| 42922.73819444444 | -0.81 |
| 42922.73819444444 | -0.81 |
| 42922.73888888889 | -0.75 |
| 42922.73888888889 | -0.75 |
| 42922.73888888889 | -0.75 |
| 42922.73888888889 | -0.69 |
| 42922.739583333336 | -0.69 |
| 42922.739583333336 | -0.75 |
| 42922.739583333336 | -0.75 |
| 42922.739583333336 | -0.75 |
| 42922.740277777775 | -0.69 |
| 42922.740277777775 | -0.69 |
| 42922.740277777775 | -0.69 |
| 42922.740277777775 | -0.69 |
| 42922.74097222222 | -0.69 |
| 42922.74097222222 | -0.75 |
| 42922.74097222222 | -0.69 |
| 42922.74166666667 | -0.69 |
| 42922.74166666667 | -0.69 |
| 42922.74166666667 | -0.69 |
| 42922.74166666667 | -0.69 |
| 42922.74236111111 | -0.69 |
| 42922.74236111111 | -0.69 |
| 42922.74236111111 | -0.69 |
| 42922.74236111111 | -0.62 |
| 42922.743055555555 | -0.69 |
| 42922.743055555555 | -0.75 |
| 42922.743055555555 | -0.69 |
| 42922.743055555555 | -0.69 |
| 42922.74375 | -0.69 |
| 42922.74375 | -0.69 |
| 42922.74375 | -0.69 |
| 42922.74375 | -0.69 |
| 42922.74444444444 | -0.69 |
| 42922.74444444444 | -0.69 |
| 42922.74444444444 | -0.69 |
| 42922.74513888889 | -0.69 |
| 42922.74513888889 | -0.69 |
| 42922.74513888889 | -0.62 |
| 42922.74513888889 | -0.62 |
| 42922.745833333334 | -0.69 |
| 42922.745833333334 | -0.62 |
| 42922.745833333334 | -0.62 |
| 42922.745833333334 | -0.62 |
| 42922.74652777778 | -0.62 |
| 42922.74652777778 | -0.62 |
| 42922.74652777778 | -0.62 |
| 42922.74652777778 | -0.62 |
| 42922.74722222222 | -0.62 |
| 42922.74722222222 | -0.62 |
| 42922.74722222222 | -0.62 |
| 42922.74722222222 | -0.62 |
| 42922.74791666667 | -0.62 |
| 42922.74791666667 | -0.62 |
| 42922.74791666667 | -0.62 |
| 42922.74791666667 | -0.56 |
| 42922.748611111114 | -0.56 |
| 42922.748611111114 | -0.56 |
| 42922.748611111114 | -0.56 |
| 42922.74930555555 | -0.56 |
| 42922.74930555555 | -0.56 |
| 42922.74930555555 | -0.56 |
| 42922.74930555555 | -0.56 |
| 42922.75 | -0.56 |
| 42922.75 | -0.56 |
| 42922.75 | -0.56 |
| 42922.75 | -0.56 |
| 42922.75069444445 | -0.56 |
| 42922.75069444445 | -0.56 |
| 42922.75069444445 | -0.5 |
| 42922.75069444445 | -0.56 |
| 42922.751388888886 | -0.5 |
| 42922.751388888886 | -0.5 |
| 42922.751388888886 | -0.5 |
| 42922.751388888886 | -0.5 |
| 42922.75208333333 | -0.56 |
| 42922.75208333333 | -0.56 |
| 42922.75208333333 | -0.56 |
| 42922.75208333333 | -0.56 |
| 42922.75277777778 | -0.56 |
| 42922.75277777778 | -0.5 |
| 42922.75277777778 | -0.5 |
| 42922.75347222222 | -0.5 |
| 42922.75347222222 | -0.5 |
| 42922.75347222222 | -0.5 |
| 42922.75347222222 | -0.5 |
| 42922.754166666666 | -0.5 |
| 42922.754166666666 | -0.5 |
| 42922.754166666666 | -0.5 |
| 42922.754166666666 | -0.5 |
| 42922.75486111111 | -0.5 |
| 42922.75486111111 | -0.5 |
| 42922.75486111111 | -0.56 |
| 42922.75486111111 | -0.56 |
| 42922.75555555556 | -0.56 |
| 42922.75555555556 | -0.44 |
| 42922.75555555556 | -0.5 |
| 42922.75555555556 | -0.5 |
| 42922.75625 | -0.5 |
| 42922.75625 | -0.5 |
| 42922.75625 | -0.44 |
| 42922.75625 | -0.5 |
| 42922.756944444445 | -0.5 |
| 42922.756944444445 | -0.5 |
| 42922.756944444445 | -0.5 |
| 42922.756944444445 | -0.5 |
| 42922.75763888889 | -0.5 |
| 42922.75763888889 | -0.5 |
| 42922.75763888889 | -0.5 |
| 42922.75833333333 | -0.5 |
| 42922.75833333333 | -0.5 |
| 42922.75833333333 | -0.5 |
| 42922.75833333333 | -0.5 |
| 42922.75902777778 | -0.5 |
| 42922.75902777778 | -0.5 |
| 42922.75902777778 | -0.5 |
| 42922.75902777778 | -0.44 |
| 42922.759722222225 | -0.5 |
| 42922.759722222225 | -0.5 |
| 42922.759722222225 | -0.5 |
| 42922.759722222225 | -0.5 |
| 42922.760416666664 | -0.5 |
| 42922.760416666664 | -0.44 |
| 42922.760416666664 | -0.5 |
| 42922.760416666664 | -0.44 |
| 42922.76111111111 | -0.44 |
| 42922.76111111111 | -0.5 |
| 42922.76111111111 | -0.5 |
| 42922.76111111111 | -0.44 |
| 42922.76180555556 | -0.44 |
| 42922.76180555556 | -0.44 |
| 42922.76180555556 | -0.44 |
| 42922.76180555556 | -0.44 |
| 42922.7625 | -0.44 |
| 42922.7625 | -0.44 |
| 42922.7625 | -0.44 |
| 42922.7625 | -0.44 |
| 42922.763194444444 | -0.44 |
| 42922.763194444444 | -0.44 |
| 42922.763194444444 | -0.44 |
| 42922.763194444444 | -0.44 |
| 42922.76388888889 | -0.44 |
| 42922.76388888889 | -0.5 |
| 42922.76388888889 | -0.44 |
| 42922.76458333333 | -0.37 |
| 42922.76458333333 | -0.37 |
| 42922.76458333333 | -0.44 |
| 42922.76458333333 | -0.37 |
| 42922.76527777778 | -0.44 |
| 42922.76527777778 | -0.44 |
| 42922.76527777778 | -0.44 |
| 42922.76527777778 | -0.44 |
| 42922.76597222222 | -0.44 |
| 42922.76597222222 | -0.44 |
| 42922.76597222222 | -0.37 |
| 42922.76597222222 | -0.44 |
| 42922.76666666667 | -0.44 |
| 42922.76666666667 | -0.44 |
| 42922.76666666667 | -0.44 |
| 42922.76666666667 | -0.37 |
| 42922.76736111111 | -0.37 |
| 42922.76736111111 | -0.37 |
| 42922.76736111111 | -0.44 |
| 42922.76736111111 | -0.44 |
| 42922.768055555556 | -0.37 |
| 42922.768055555556 | -0.44 |
| 42922.768055555556 | -0.44 |
| 42922.768055555556 | -0.44 |
| 42922.76875 | -0.37 |
| 42922.76875 | -0.44 |
| 42922.76875 | -0.37 |
| 42922.76944444444 | -0.37 |
| 42922.76944444444 | -0.37 |
| 42922.76944444444 | -0.37 |
| 42922.76944444444 | -0.37 |
| 42922.77013888889 | -0.44 |
| 42922.77013888889 | -0.37 |
| 42922.77013888889 | -0.37 |
| 42922.77013888889 | -0.44 |
| 42922.770833333336 | -0.37 |
| 42922.770833333336 | -0.37 |
| 42922.770833333336 | -0.37 |
| 42922.770833333336 | -0.31 |
| 42922.771527777775 | -0.37 |
| 42922.771527777775 | -0.37 |
| 42922.771527777775 | -0.37 |
| 42922.771527777775 | -0.37 |
| 42922.77222222222 | -0.31 |
| 42922.77222222222 | -0.31 |
| 42922.77222222222 | -0.31 |
| 42922.77222222222 | -0.31 |
| 42922.77291666667 | -0.31 |
| 42922.77291666667 | -0.31 |
| 42922.77291666667 | -0.31 |
| 42922.77291666667 | -0.37 |
| 42922.77361111111 | -0.31 |
| 42922.77361111111 | -0.31 |
| 42922.77361111111 | -0.31 |
| 42922.77361111111 | -0.31 |
| 42922.774305555555 | -0.31 |
| 42922.774305555555 | -0.25 |
| 42922.774305555555 | -0.25 |
| 42922.774305555555 | -0.31 |
| 42922.775 | -0.31 |
| 42922.775 | -0.25 |
| 42922.775 | -0.25 |
| 42922.775 | -0.25 |
| 42922.77569444444 | -0.31 |
| 42922.77569444444 | -0.31 |
| 42922.77569444444 | -0.25 |
| 42922.77638888889 | -0.31 |
| 42922.77638888889 | -0.31 |
| 42922.77638888889 | -0.31 |
| 42922.77638888889 | -0.31 |
| 42922.777083333334 | -0.19 |
| 42922.777083333334 | -0.25 |
| 42922.777083333334 | -0.19 |
| 42922.777083333334 | -0.25 |
| 42922.77777777778 | -0.19 |
| 42922.77777777778 | -0.25 |
| 42922.77777777778 | -0.25 |
| 42922.77777777778 | -0.25 |
| 42922.77847222222 | -0.25 |
| 42922.77847222222 | -0.25 |
| 42922.77847222222 | -0.19 |
| 42922.77847222222 | -0.25 |
| 42922.77916666667 | -0.19 |
| 42922.77916666667 | -0.19 |
| 42922.77916666667 | -0.25 |
| 42922.77916666667 | -0.25 |
| 42922.779861111114 | -0.25 |
| 42922.779861111114 | -0.19 |
| 42922.779861111114 | -0.19 |
| 42922.779861111114 | -0.25 |
| 42922.78055555555 | -0.19 |
| 42922.78055555555 | -0.19 |
| 42922.78055555555 | -0.19 |
| 42922.78125 | -0.19 |
| 42922.78125 | -0.19 |
| 42922.78125 | -0.19 |
| 42922.78125 | -0.19 |
| 42922.78194444445 | -0.19 |
| 42922.78194444445 | -0.19 |
| 42922.78194444445 | -0.19 |
| 42922.78194444445 | -0.19 |
| 42922.782638888886 | -0.19 |
| 42922.782638888886 | -0.19 |
| 42922.782638888886 | -0.19 |
| 42922.782638888886 | -0.19 |
| 42922.78333333333 | -0.19 |
| 42922.78333333333 | -0.19 |
| 42922.78333333333 | -0.19 |
| 42922.78333333333 | -0.19 |
| 42922.78402777778 | -0.19 |
| 42922.78402777778 | -0.25 |
| 42922.78402777778 | -0.19 |
| 42922.78402777778 | -0.25 |
| 42922.78472222222 | -0.13 |
| 42922.78472222222 | -0.25 |
| 42922.78472222222 | -0.13 |
| 42922.785416666666 | -0.19 |
| 42922.785416666666 | -0.19 |
| 42922.785416666666 | -0.19 |
| 42922.785416666666 | -0.19 |
| 42922.78611111111 | -0.19 |
| 42922.78611111111 | -0.19 |
| 42922.78611111111 | -0.19 |
| 42922.78611111111 | -0.19 |
| 42922.78680555556 | -0.19 |
| 42922.78680555556 | -0.13 |
| 42922.78680555556 | -0.19 |
| 42922.78680555556 | -0.19 |
| 42922.7875 | -0.19 |
| 42922.7875 | -0.19 |
| 42922.7875 | -0.19 |
| 42922.7875 | -0.19 |
| 42922.788194444445 | -0.13 |
| 42922.788194444445 | -0.13 |
| 42922.788194444445 | -0.13 |
| 42922.788194444445 | -0.19 |
| 42922.78888888889 | -0.19 |
| 42922.78888888889 | -0.13 |
| 42922.78888888889 | -0.13 |
| 42922.78888888889 | -0.19 |
| 42922.78958333333 | -0.13 |
| 42922.78958333333 | -0.13 |
| 42922.78958333333 | -0.19 |
| 42922.78958333333 | -0.13 |
| 42922.79027777778 | -0.19 |
| 42922.79027777778 | -0.19 |
| 42922.79027777778 | -0.19 |
| 42922.790972222225 | -0.19 |
| 42922.790972222225 | -0.19 |
| 42922.790972222225 | -0.19 |
| 42922.790972222225 | -0.19 |
| 42922.791666666664 | -0.19 |
| 42922.791666666664 | -0.19 |
| 42922.791666666664 | -0.13 |
| 42922.791666666664 | -0.13 |
| 42922.79236111111 | -0.06 |
| 42922.79236111111 | -0.13 |
| 42922.79236111111 | -0.13 |
| 42922.79236111111 | -0.13 |
| 42922.79305555556 | -0.13 |
| 42922.79305555556 | -0.13 |
| 42922.79305555556 | -0.13 |
| 42922.79305555556 | -0.13 |
| 42922.79375 | -0.13 |
| 42922.79375 | -0.19 |
| 42922.79375 | -0.19 |
| 42922.79375 | -0.19 |
| 42922.794444444444 | -0.13 |
| 42922.794444444444 | -0.19 |
| 42922.794444444444 | -0.19 |
| 42922.794444444444 | -0.06 |
| 42922.79513888889 | -0.13 |
| 42922.79513888889 | -0.13 |
| 42922.79513888889 | -0.06 |
| 42922.79513888889 | -0.19 |
| 42922.79583333333 | -0.13 |
| 42922.79583333333 | -0.13 |
| 42922.79583333333 | -0.13 |
| 42922.79583333333 | -0.13 |
| 42922.79652777778 | -0.13 |
| 42922.79652777778 | -0.19 |
| 42922.79652777778 | -0.13 |
| 42922.79652777778 | -0.06 |
| 42922.79722222222 | -0.13 |
| 42922.79722222222 | -0.13 |
| 42922.79722222222 | -0.19 |
| 42922.79722222222 | -0.13 |
| 42922.79791666667 | -0.13 |
| 42922.79791666667 | -0.13 |
| 42922.79791666667 | -0.13 |
| 42922.79791666667 | -0.13 |
| 42922.79861111111 | -0.13 |
| 42922.79861111111 | -0.13 |
| 42922.79861111111 | -0.13 |
| 42922.79861111111 | -0.19 |
| 42922.799305555556 | -0.06 |
| 42922.799305555556 | -0.13 |
| 42922.799305555556 | -0.13 |
| 42922.799305555556 | -0.13 |
| 42922.8 | -0.13 |
| 42922.8 | -0.13 |
| 42922.8 | -0.06 |
| 42922.80069444444 | -0.13 |
| 42922.80069444444 | -0.06 |
| 42922.80069444444 | -0.06 |
| 42922.80069444444 | 0 |
| 42922.80138888889 | -0.13 |
| 42922.80138888889 | -0.13 |
| 42922.80138888889 | -0.06 |
| 42922.80138888889 | -0.13 |
| 42922.802083333336 | -0.06 |
| 42922.802083333336 | -0.13 |
| 42922.802083333336 | -0.13 |
| 42922.802083333336 | -0.06 |
| 42922.802777777775 | 0 |
| 42922.802777777775 | -0.13 |
| 42922.802777777775 | -0.13 |
| 42922.802777777775 | -0.06 |
| 42922.80347222222 | -0.13 |
| 42922.80347222222 | 0 |
| 42922.80347222222 | -0.13 |
| 42922.80347222222 | -0.13 |
| 42922.80416666667 | 0 |
| 42922.80416666667 | -0.13 |
| 42922.80416666667 | -0.13 |
| 42922.80416666667 | -0.13 |
| 42922.80486111111 | -0.13 |
| 42922.80486111111 | 0 |
| 42922.80486111111 | -0.06 |
| 42922.80486111111 | -0.13 |
| 42922.805555555555 | -0.06 |
| 42922.805555555555 | -0.06 |
| 42922.805555555555 | -0.06 |
| 42922.80625 | -0.06 |
| 42922.80625 | -0.06 |
| 42922.80625 | -0.13 |
| 42922.80625 | -0.06 |
| 42922.80694444444 | -0.13 |
| 42922.80694444444 | -0.13 |
| 42922.80694444444 | -0.06 |
| 42922.80694444444 | -0.19 |
| 42922.80763888889 | 0.06 |
| 42922.80763888889 | -0.06 |
| 42922.80763888889 | -0.06 |
| 42922.80763888889 | 0 |
| 42922.808333333334 | -0.06 |
| 42922.808333333334 | -0.13 |
| 42922.808333333334 | -0.13 |
| 42922.808333333334 | -0.13 |
| 42922.80902777778 | -0.06 |
| 42922.80902777778 | -0.13 |
| 42922.80902777778 | -0.19 |
| 42922.80902777778 | -0.13 |
| 42922.80972222222 | -0.06 |
| 42922.80972222222 | -0.19 |
| 42922.80972222222 | 0 |
| 42922.80972222222 | -0.19 |
| 42922.81041666667 | -0.19 |
| 42922.81041666667 | -0.13 |
| 42922.81041666667 | 0 |
| 42922.81041666667 | -0.19 |
| 42922.811111111114 | -0.06 |
| 42922.811111111114 | -0.19 |
| 42922.811111111114 | -0.06 |
| 42922.811111111114 | -0.06 |
| 42922.81180555555 | -0.13 |
| 42922.81180555555 | 0 |
| 42922.81180555555 | -0.13 |
| 42922.8125 | -0.13 |
| 42922.8125 | -0.06 |
| 42922.8125 | -0.06 |
| 42922.8125 | -0.06 |
| 42922.81319444445 | -0.06 |
| 42922.81319444445 | -0.06 |
| 42922.81319444445 | -0.13 |
| 42922.81319444445 | -0.13 |
| 42922.813888888886 | -0.06 |
| 42922.813888888886 | 0 |
| 42922.813888888886 | 0 |
| 42922.813888888886 | -0.06 |
| 42922.81458333333 | -0.06 |
| 42922.81458333333 | -0.13 |
| 42922.81458333333 | -0.13 |
| 42922.81458333333 | -0.06 |
| 42922.81527777778 | 0 |
| 42922.81527777778 | -0.06 |
| 42922.81527777778 | -0.13 |
| 42922.81527777778 | -0.06 |
| 42922.81597222222 | -0.19 |
| 42922.81597222222 | 0 |
| 42922.81597222222 | -0.06 |
| 42922.81597222222 | -0.06 |
| 42922.816666666666 | 0 |
| 42922.816666666666 | -0.06 |
| 42922.816666666666 | -0.13 |
| 42922.81736111111 | -0.06 |
| 42922.81736111111 | -0.06 |
| 42922.81736111111 | -0.06 |
| 42922.81736111111 | -0.13 |
| 42922.81805555556 | 0 |
| 42922.81805555556 | -0.06 |
| 42922.81805555556 | -0.06 |
| 42922.81805555556 | -0.06 |
| 42922.81875 | -0.13 |
| 42922.81875 | -0.06 |
| 42922.81875 | -0.06 |
| 42922.81875 | -0.06 |
| 42922.819444444445 | -0.06 |
| 42922.819444444445 | -0.06 |
| 42922.819444444445 | -0.06 |
| 42922.819444444445 | -0.06 |
| 42922.82013888889 | -0.06 |
| 42922.82013888889 | -0.13 |
| 42922.82013888889 | -0.13 |
| 42922.82013888889 | -0.13 |
| 42922.82083333333 | -0.06 |
| 42922.82083333333 | -0.06 |
| 42922.82083333333 | -0.19 |
| 42922.82083333333 | -0.06 |
| 42922.82152777778 | -0.06 |
| 42922.82152777778 | -0.19 |
| 42922.82152777778 | -0.06 |
| 42922.82152777778 | -0.19 |
| 42922.822222222225 | -0.19 |
| 42922.822222222225 | -0.19 |
| 42922.822222222225 | -0.13 |
| 42922.822222222225 | 0 |
| 42922.822916666664 | -0.13 |
| 42922.822916666664 | -0.13 |
| 42922.822916666664 | 0 |
| 42922.82361111111 | 0 |
| 42922.82361111111 | -0.06 |
| 42922.82361111111 | -0.19 |
| 42922.82361111111 | -0.13 |
| 42922.82430555556 | -0.13 |
| 42922.82430555556 | -0.19 |
| 42922.82430555556 | -0.06 |
| 42922.82430555556 | -0.19 |
| 42922.825 | -0.06 |
| 42922.825 | -0.06 |
| 42922.825 | -0.06 |
| 42922.825 | -0.06 |
| 42922.825694444444 | -0.06 |
| 42922.825694444444 | -0.06 |
| 42922.825694444444 | -0.06 |
| 42922.825694444444 | -0.06 |
| 42922.82638888889 | 0 |
| 42922.82638888889 | -0.06 |
| 42922.82638888889 | -0.06 |
| 42922.82638888889 | -0.06 |
| 42922.82708333333 | -0.13 |
| 42922.82708333333 | -0.13 |
| 42922.82708333333 | 0 |
| 42922.82708333333 | -0.06 |
| 42922.82777777778 | -0.06 |
| 42922.82777777778 | -0.13 |
| 42922.82777777778 | -0.13 |
| 42922.82777777778 | 0 |
| 42922.82847222222 | -0.06 |
| 42922.82847222222 | -0.06 |
| 42922.82847222222 | -0.06 |
| 42922.82916666667 | -0.13 |
| 42922.82916666667 | -0.06 |
| 42922.82916666667 | -0.06 |
| 42922.82916666667 | -0.06 |
| 42922.82986111111 | -0.13 |
| 42922.82986111111 | -0.13 |
| 42922.82986111111 | -0.13 |
| 42922.82986111111 | -0.19 |
| 42922.830555555556 | -0.13 |
| 42922.830555555556 | 0 |
| 42922.830555555556 | -0.06 |
| 42922.830555555556 | -0.06 |
| 42922.83125 | -0.06 |
| 42922.83125 | -0.06 |
| 42922.83125 | 0 |
| 42922.83125 | 0 |
| 42922.83194444444 | -0.06 |
| 42922.83194444444 | 0 |
| 42922.83194444444 | -0.06 |
| 42922.83194444444 | -0.13 |
| 42922.83263888889 | 0 |
| 42922.83263888889 | -0.13 |
| 42922.83263888889 | -0.13 |
| 42922.83263888889 | -0.06 |
| 42922.833333333336 | -0.13 |
| 42922.833333333336 | -0.13 |
| 42922.833333333336 | -0.06 |
| 42922.833333333336 | -0.13 |
| 42922.834027777775 | -0.06 |
| 42922.834027777775 | -0.06 |
| 42922.834027777775 | -0.06 |
| 42922.834027777775 | -0.13 |
| 42922.83472222222 | 0 |
| 42922.83472222222 | 0 |
| 42922.83472222222 | -0.06 |
| 42922.83541666667 | 0 |
| 42922.83541666667 | -0.13 |
| 42922.83541666667 | -0.13 |
| 42922.83541666667 | -0.13 |
| 42922.83611111111 | -0.06 |
| 42922.83611111111 | -0.13 |
| 42922.83611111111 | -0.06 |
| 42922.83611111111 | -0.06 |
| 42922.836805555555 | -0.06 |
| 42922.836805555555 | -0.13 |
| 42922.836805555555 | -0.13 |
| 42922.836805555555 | -0.06 |
| 42922.8375 | -0.06 |
| 42922.8375 | -0.06 |
| 42922.8375 | -0.06 |
| 42922.8375 | -0.06 |
| 42922.83819444444 | -0.06 |
| 42922.83819444444 | -0.06 |
| 42922.83819444444 | -0.06 |
| 42922.83819444444 | -0.13 |
| 42922.83888888889 | -0.13 |
| 42922.83888888889 | -0.06 |
| 42922.83888888889 | -0.06 |
| 42922.83888888889 | -0.13 |
| 42922.839583333334 | -0.13 |
| 42922.839583333334 | -0.06 |
| 42922.839583333334 | -0.13 |
| 42922.839583333334 | -0.13 |
| 42922.84027777778 | -0.13 |
| 42922.84027777778 | -0.06 |
| 42922.84027777778 | -0.06 |
| 42922.84027777778 | -0.06 |
| 42922.84097222222 | -0.06 |
| 42922.84097222222 | -0.06 |
| 42922.84097222222 | -0.13 |
| 42922.84097222222 | -0.06 |
| 42922.84166666667 | -0.13 |
| 42922.84166666667 | -0.13 |
| 42922.84166666667 | -0.13 |
| 42922.84166666667 | -0.13 |
| 42922.842361111114 | -0.06 |
| 42922.842361111114 | -0.13 |
| 42922.842361111114 | -0.13 |
| 42922.842361111114 | -0.06 |
| 42922.84305555555 | -0.06 |
| 42922.84305555555 | 0 |
| 42922.84305555555 | -0.06 |
| 42922.84305555555 | -0.13 |
| 42922.84375 | -0.06 |
| 42922.84375 | -0.06 |
| 42922.84375 | -0.06 |
| 42922.84444444445 | -0.06 |
| 42922.84444444445 | -0.13 |
| 42922.84444444445 | -0.06 |
| 42922.84444444445 | -0.19 |
| 42922.845138888886 | -0.06 |
| 42922.845138888886 | -0.19 |
| 42922.845138888886 | -0.06 |
| 42922.845138888886 | -0.13 |
| 42922.84583333333 | -0.19 |
| 42922.84583333333 | -0.13 |
| 42922.84583333333 | 0 |
| 42922.84583333333 | -0.06 |
| 42922.84652777778 | -0.13 |
| 42922.84652777778 | -0.06 |
| 42922.84652777778 | -0.19 |
| 42922.84652777778 | -0.19 |
| 42922.84722222222 | -0.19 |
| 42922.84722222222 | -0.13 |
| 42922.84722222222 | -0.19 |
| 42922.84722222222 | -0.06 |
| 42922.847916666666 | -0.06 |
| 42922.847916666666 | -0.19 |
| 42922.847916666666 | -0.06 |
| 42922.84861111111 | -0.13 |
| 42922.84861111111 | -0.13 |
| 42922.84861111111 | -0.13 |
| 42922.84861111111 | -0.19 |
| 42922.84930555556 | -0.13 |
| 42922.84930555556 | -0.13 |
| 42922.84930555556 | -0.19 |
| 42922.84930555556 | -0.19 |
| 42922.85 | -0.13 |
| 42922.85 | -0.19 |
| 42922.85 | -0.19 |
| 42922.85 | -0.13 |
| 42922.850694444445 | -0.13 |
| 42922.850694444445 | -0.13 |
| 42922.850694444445 | -0.13 |
| 42922.850694444445 | -0.19 |
| 42922.85138888889 | -0.19 |
| 42922.85138888889 | -0.06 |
| 42922.85138888889 | -0.19 |
| 42922.85138888889 | -0.13 |
| 42922.85208333333 | -0.25 |
| 42922.85208333333 | -0.19 |
| 42922.85208333333 | -0.13 |
| 42922.85208333333 | -0.13 |
| 42922.85277777778 | -0.13 |
| 42922.85277777778 | -0.19 |
| 42922.85277777778 | -0.06 |
| 42922.85277777778 | -0.19 |
| 42922.853472222225 | -0.19 |
| 42922.853472222225 | -0.13 |
| 42922.853472222225 | -0.13 |
| 42922.853472222225 | -0.19 |
| 42922.854166666664 | -0.13 |
| 42922.854166666664 | -0.06 |
| 42922.854166666664 | -0.13 |
| 42922.854166666664 | -0.19 |
| 42922.85486111111 | -0.19 |
| 42922.85486111111 | -0.19 |
| 42922.85486111111 | -0.19 |
| 42922.85555555556 | -0.13 |
| 42922.85555555556 | -0.13 |
| 42922.85555555556 | -0.19 |
| 42922.85555555556 | -0.13 |
| 42922.85625 | -0.13 |
| 42922.85625 | -0.13 |
| 42922.85625 | -0.13 |
| 42922.85625 | -0.13 |
| 42922.856944444444 | -0.13 |
| 42922.856944444444 | -0.13 |
| 42922.856944444444 | -0.13 |
| 42922.856944444444 | -0.13 |
| 42922.85763888889 | -0.13 |
| 42922.85763888889 | -0.13 |
| 42922.85763888889 | -0.13 |
| 42922.85763888889 | -0.13 |
| 42922.85833333333 | -0.19 |
| 42922.85833333333 | -0.13 |
| 42922.85833333333 | -0.13 |
| 42922.85833333333 | -0.19 |
| 42922.85902777778 | -0.19 |
| 42922.85902777778 | -0.13 |
| 42922.85902777778 | -0.19 |
| 42922.85902777778 | -0.19 |
| 42922.85972222222 | -0.25 |
| 42922.85972222222 | -0.19 |
| 42922.85972222222 | -0.25 |
| 42922.85972222222 | -0.13 |
| 42922.86041666667 | -0.13 |
| 42922.86041666667 | -0.25 |
| 42922.86041666667 | -0.13 |
| 42922.86041666667 | -0.19 |
| 42922.86111111111 | -0.13 |
| 42922.86111111111 | -0.25 |
| 42922.86111111111 | -0.13 |
| 42922.86111111111 | -0.19 |
| 42922.861805555556 | -0.19 |
| 42922.861805555556 | -0.13 |
| 42922.861805555556 | -0.19 |
| 42922.861805555556 | -0.19 |
| 42922.8625 | -0.19 |
| 42922.8625 | -0.19 |
| 42922.8625 | -0.19 |
| 42922.86319444444 | -0.13 |
| 42922.86319444444 | -0.19 |
| 42922.86319444444 | -0.19 |
| 42922.86319444444 | -0.13 |
| 42922.86388888889 | -0.19 |
| 42922.86388888889 | -0.13 |
| 42922.86388888889 | -0.19 |
| 42922.86388888889 | -0.13 |
| 42922.864583333336 | -0.19 |
| 42922.864583333336 | -0.13 |
| 42922.864583333336 | -0.19 |
| 42922.864583333336 | -0.19 |
| 42922.865277777775 | -0.13 |
| 42922.865277777775 | -0.19 |
| 42922.865277777775 | -0.25 |
| 42922.865277777775 | -0.19 |
| 42922.86597222222 | -0.19 |
| 42922.86597222222 | -0.19 |
| 42922.86597222222 | -0.19 |
| 42922.86597222222 | -0.19 |
| 42922.86666666667 | -0.19 |
| 42922.86666666667 | -0.13 |
| 42922.86666666667 | -0.13 |
| 42922.86666666667 | -0.13 |
| 42922.86736111111 | -0.25 |
| 42922.86736111111 | -0.25 |
| 42922.86736111111 | -0.13 |
| 42922.86736111111 | -0.19 |
| 42922.868055555555 | -0.25 |
| 42922.868055555555 | -0.25 |
| 42922.868055555555 | -0.19 |
| 42922.86875 | -0.19 |
| 42922.86875 | -0.19 |
| 42922.86875 | -0.19 |
| 42922.86875 | -0.25 |
| 42922.86944444444 | -0.19 |
| 42922.86944444444 | -0.19 |
| 42922.86944444444 | -0.13 |
| 42922.86944444444 | -0.19 |
| 42922.87013888889 | -0.19 |
| 42922.87013888889 | -0.19 |
| 42922.87013888889 | -0.19 |
| 42922.87013888889 | -0.13 |
| 42922.870833333334 | -0.19 |
| 42922.870833333334 | -0.19 |
| 42922.870833333334 | -0.19 |
| 42922.870833333334 | -0.19 |
| 42922.87152777778 | -0.19 |
| 42922.87152777778 | -0.19 |
| 42922.87152777778 | -0.19 |
| 42922.87152777778 | -0.25 |
| 42922.87222222222 | -0.25 |
| 42922.87222222222 | -0.19 |
| 42922.87222222222 | -0.19 |
| 42922.87222222222 | -0.19 |
| 42922.87291666667 | -0.19 |
| 42922.87291666667 | -0.19 |
| 42922.87291666667 | -0.13 |
| 42922.87291666667 | -0.19 |
| 42922.873611111114 | -0.19 |
| 42922.873611111114 | -0.13 |
| 42922.873611111114 | -0.19 |
| 42922.87430555555 | -0.19 |
| 42922.87430555555 | -0.19 |
| 42922.87430555555 | -0.19 |
| 42922.87430555555 | -0.19 |
| 42922.875 | -0.19 |
| 42922.875 | -0.19 |
| 42922.875 | -0.19 |
| 42922.875 | -0.19 |
| 42922.87569444445 | -0.19 |
| 42922.87569444445 | -0.19 |
| 42922.87569444445 | -0.19 |
| 42922.87569444445 | -0.19 |
| 42922.876388888886 | -0.19 |
| 42922.876388888886 | -0.19 |
| 42922.876388888886 | -0.19 |
| 42922.876388888886 | -0.19 |
| 42922.87708333333 | -0.19 |
| 42922.87708333333 | -0.19 |
| 42922.87708333333 | -0.19 |
| 42922.87708333333 | -0.19 |
| 42922.87777777778 | -0.19 |
| 42922.87777777778 | -0.25 |
| 42922.87777777778 | -0.13 |
| 42922.87777777778 | -0.19 |
| 42922.87847222222 | -0.19 |
| 42922.87847222222 | -0.19 |
| 42922.87847222222 | -0.19 |
| 42922.87847222222 | -0.19 |
| 42922.879166666666 | -0.19 |
| 42922.879166666666 | -0.19 |
| 42922.879166666666 | -0.19 |
| 42922.879166666666 | -0.19 |
| 42922.87986111111 | -0.19 |
| 42922.87986111111 | -0.19 |
| 42922.87986111111 | -0.19 |
| 42922.88055555556 | -0.19 |
| 42922.88055555556 | -0.19 |
| 42922.88055555556 | -0.19 |
| 42922.88055555556 | -0.25 |
| 42922.88125 | -0.13 |
| 42922.88125 | -0.13 |
| 42922.88125 | -0.19 |
| 42922.88125 | -0.19 |
| 42922.881944444445 | -0.25 |
| 42922.881944444445 | -0.19 |
| 42922.881944444445 | -0.19 |
| 42922.881944444445 | -0.19 |
| 42922.88263888889 | -0.19 |
| 42922.88263888889 | -0.19 |
| 42922.88263888889 | -0.19 |
| 42922.88263888889 | -0.19 |
| 42922.88333333333 | -0.19 |
| 42922.88333333333 | -0.19 |
| 42922.88333333333 | -0.19 |
| 42922.88333333333 | -0.19 |
| 42922.88402777778 | -0.19 |
| 42922.88402777778 | -0.19 |
| 42922.88402777778 | -0.19 |
| 42922.88402777778 | -0.25 |
| 42922.884722222225 | -0.25 |
| 42922.884722222225 | -0.19 |
| 42922.884722222225 | -0.25 |
| 42922.884722222225 | -0.25 |
| 42922.885416666664 | -0.19 |
| 42922.885416666664 | -0.19 |
| 42922.885416666664 | -0.19 |
| 42922.88611111111 | -0.25 |
| 42922.88611111111 | -0.19 |
| 42922.88611111111 | -0.19 |
| 42922.88611111111 | -0.19 |
| 42922.88680555556 | -0.19 |
| 42922.88680555556 | -0.19 |